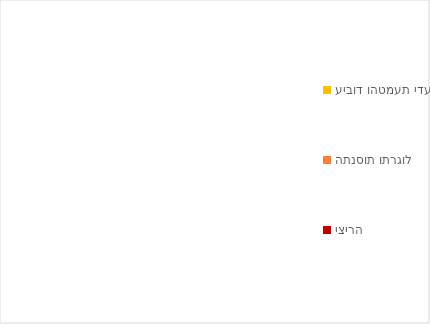
| Category | Series 0 |
|---|---|
| עיבוד והטמעת ידע | 0 |
| התנסות ותרגול | 0 |
| יצירה | 0 |